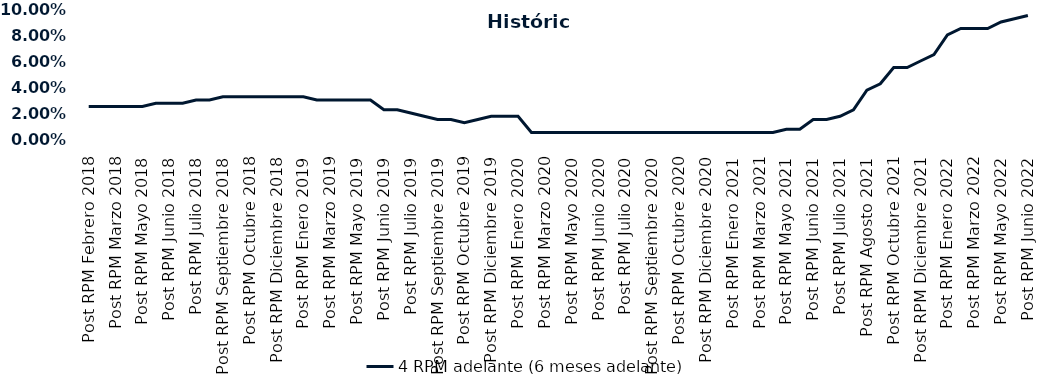
| Category | 4 RPM adelante (6 meses adelante) |
|---|---|
| Post RPM Febrero 2018 | 0.025 |
| Pre RPM Marzo 2018 | 0.025 |
| Post RPM Marzo 2018 | 0.025 |
| Pre RPM Mayo 2018 | 0.025 |
| Post RPM Mayo 2018 | 0.025 |
| Pre RPM Junio 2018 | 0.028 |
| Post RPM Junio 2018 | 0.028 |
| Pre RPM Julio 2018 | 0.028 |
| Post RPM Julio 2018 | 0.03 |
| Pre RPM Septiembre 2018 | 0.03 |
| Post RPM Septiembre 2018 | 0.032 |
| Pre RPM Octubre 2018 | 0.032 |
| Post RPM Octubre 2018 | 0.032 |
| Pre RPM Diciembre 2018 | 0.032 |
| Post RPM Diciembre 2018 | 0.032 |
| Pre RPM Enero 2019 | 0.032 |
| Post RPM Enero 2019 | 0.032 |
| Pre RPM Marzo 2019 | 0.03 |
| Post RPM Marzo 2019 | 0.03 |
| Pre RPM Mayo 2019 | 0.03 |
| Post RPM Mayo 2019 | 0.03 |
| Pre RPM Junio 2019 | 0.03 |
| Post RPM Junio 2019 | 0.022 |
| Pre RPM Julio 2019 | 0.022 |
| Post RPM Julio 2019 | 0.02 |
| Pre RPM Septiembre 2019 | 0.018 |
| Post RPM Septiembre 2019 | 0.015 |
| Pre RPM Octubre 2019 | 0.015 |
| Post RPM Octubre 2019 | 0.012 |
| Pre RPM Diciembre 2019 | 0.015 |
| Post RPM Diciembre 2019 | 0.018 |
| Pre RPM Enero 2020 | 0.018 |
| Post RPM Enero 2020 | 0.018 |
| Pre RPM Marzo 2020 | 0.005 |
| Post RPM Marzo 2020 | 0.005 |
| Pre RPM Mayo 2020 | 0.005 |
| Post RPM Mayo 2020 | 0.005 |
| Pre RPM Junio 2020 | 0.005 |
| Post RPM Junio 2020 | 0.005 |
| Pre RPM Julio 2020 | 0.005 |
| Post RPM Julio 2020 | 0.005 |
| Pre RPM Septiembre 2020 | 0.005 |
| Post RPM Septiembre 2020 | 0.005 |
| Pre RPM Octubre 2020 | 0.005 |
| Post RPM Octubre 2020 | 0.005 |
| Pre RPM Diciembre 2020 | 0.005 |
| Post RPM Diciembre 2020 | 0.005 |
| Pre RPM Enero 2021 | 0.005 |
| Post RPM Enero 2021 | 0.005 |
| Pre RPM Marzo 2021 | 0.005 |
| Post RPM Marzo 2021 | 0.005 |
| Pre RPM Mayo 2021 | 0.005 |
| Post RPM Mayo 2021 | 0.008 |
| Pre RPM Junio 2021 | 0.008 |
| Post RPM Junio 2021 | 0.015 |
| Pre RPM Julio 2021 | 0.015 |
| Post RPM Julio 2021 | 0.018 |
| Pre RPM Agosto 2021 | 0.022 |
| Post RPM Agosto 2021 | 0.038 |
| Pre RPM Octubre 2021 | 0.042 |
| Post RPM Octubre 2021 | 0.055 |
| Pre RPM Diciembre 2021 | 0.055 |
| Post RPM Diciembre 2021 | 0.06 |
| Pre RPM Enero 2022 | 0.065 |
| Post RPM Enero 2022 | 0.08 |
| Pre RPM Marzo 2022 | 0.085 |
| Post RPM Marzo 2022 | 0.085 |
| Pre RPM Mayo 2022 | 0.085 |
| Post RPM Mayo 2022 | 0.09 |
| Pre RPM Junio 2022 | 0.092 |
| Post RPM Junio 2022 | 0.095 |